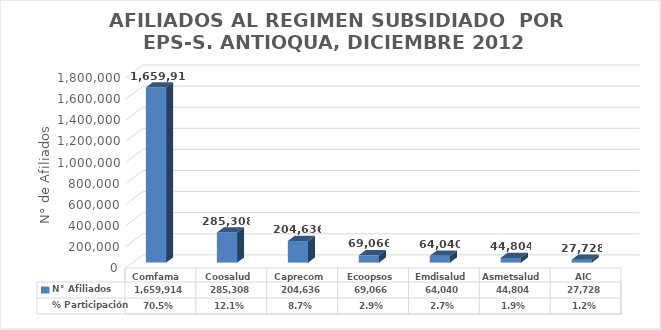
| Category | N° Afiliados | % Participación |
|---|---|---|
| Comfama  | 1659914 | 0.705 |
| Coosalud | 285308 | 0.121 |
| Caprecom | 204636 | 0.087 |
| Ecoopsos | 69066 | 0.029 |
| Emdisalud | 64040 | 0.027 |
| Asmetsalud | 44804 | 0.019 |
| AIC | 27728 | 0.012 |